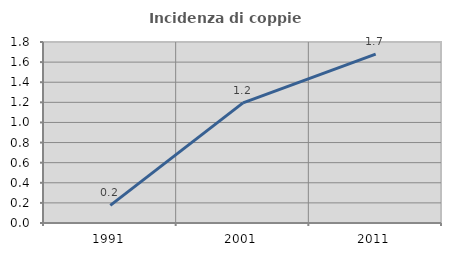
| Category | Incidenza di coppie miste |
|---|---|
| 1991.0 | 0.175 |
| 2001.0 | 1.195 |
| 2011.0 | 1.679 |